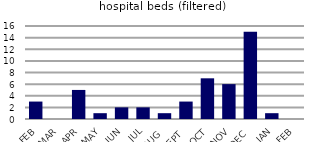
| Category | hospital beds (filtered) |
|---|---|
| FEB | 3 |
| MAR | 0 |
| APR | 5 |
| MAY | 1 |
| JUN | 2 |
| JUL | 2 |
| AUG | 1 |
| SEPT | 3 |
| OCT | 7 |
| NOV | 6 |
| DEC | 15 |
| JAN | 1 |
| FEB | 0 |